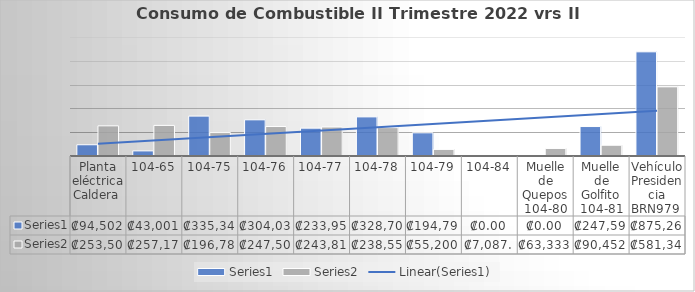
| Category | Series 0 | Series 1 |
|---|---|---|
| Planta eléctrica Caldera  | 94502 | 253500 |
| 104-65 | 43001 | 257174 |
| 104-75 | 335349 | 196789 |
| 104-76 | 304037 | 247507 |
| 104-77 | 233958 | 243811 |
| 104-78 | 328702 | 238551 |
| 104-79 | 194797 | 55200 |
| 104-84 | 0 | 7087 |
| Muelle de Quepos 104-80 | 0 | 63333 |
| Muelle de Golfito 104-81 | 247596 | 90452 |
| Vehículo Presidencia BRN979  | 875265 | 581341 |